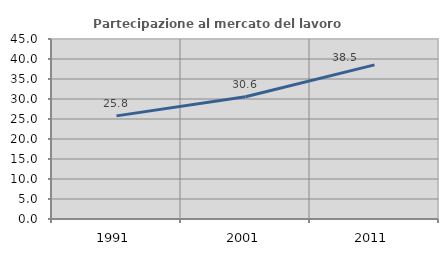
| Category | Partecipazione al mercato del lavoro  femminile |
|---|---|
| 1991.0 | 25.779 |
| 2001.0 | 30.556 |
| 2011.0 | 38.525 |